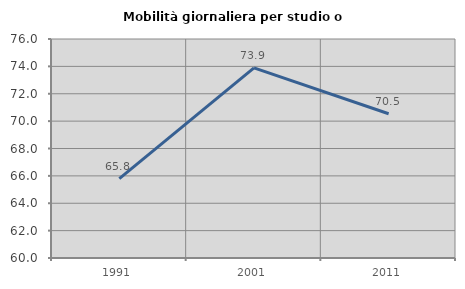
| Category | Mobilità giornaliera per studio o lavoro |
|---|---|
| 1991.0 | 65.797 |
| 2001.0 | 73.885 |
| 2011.0 | 70.536 |